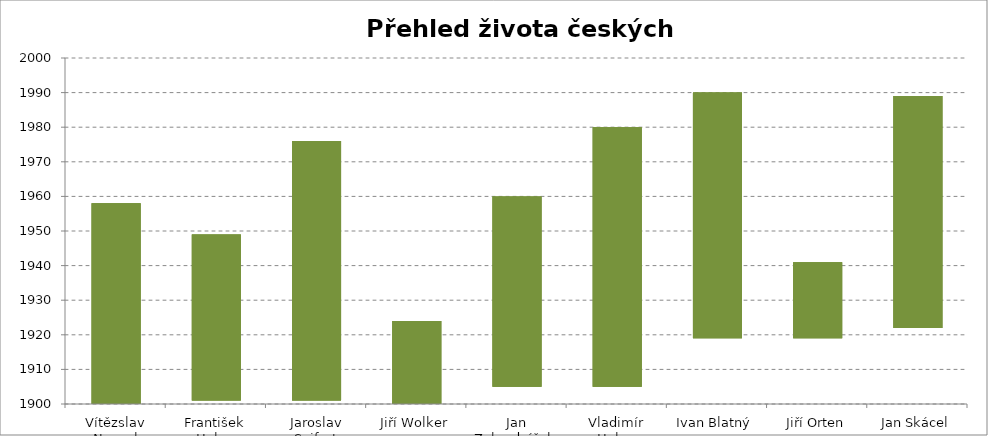
| Category | narozen | Series 1 | zemřel |
|---|---|---|---|
| Vítězslav Nezval | 1900 |  | 1958 |
| František Halas | 1901 |  | 1949 |
| Jaroslav Seifert | 1901 |  | 1976 |
| Jiří Wolker | 1900 |  | 1924 |
| Jan Zahradníček | 1905 |  | 1960 |
| Vladimír Holan | 1905 |  | 1980 |
| Ivan Blatný | 1919 |  | 1990 |
| Jiří Orten | 1919 |  | 1941 |
| Jan Skácel | 1922 |  | 1989 |